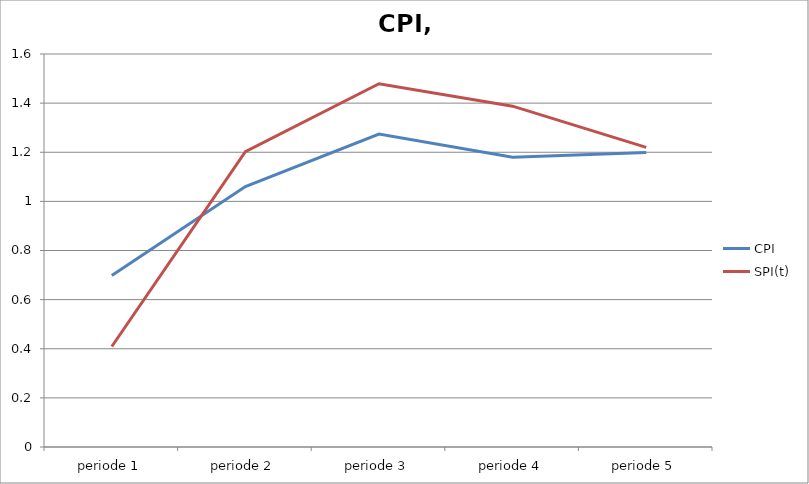
| Category | CPI | SPI(t) |
|---|---|---|
| periode 1 | 0.698 | 0.409 |
| periode 2 | 1.06 | 1.203 |
| periode 3 | 1.274 | 1.479 |
| periode 4 | 1.179 | 1.388 |
| periode 5 | 1.199 | 1.22 |